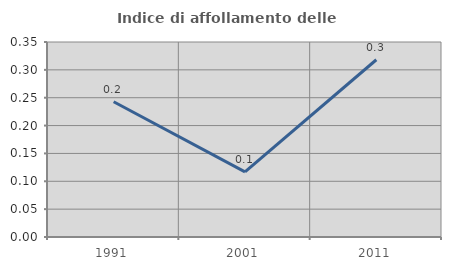
| Category | Indice di affollamento delle abitazioni  |
|---|---|
| 1991.0 | 0.243 |
| 2001.0 | 0.117 |
| 2011.0 | 0.318 |